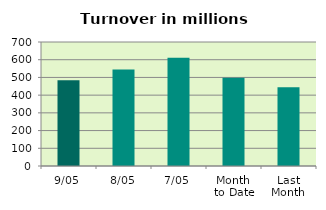
| Category | Series 0 |
|---|---|
| 9/05 | 484.108 |
| 8/05 | 545.129 |
| 7/05 | 611.136 |
| Month 
to Date | 498.698 |
| Last
Month | 444.663 |